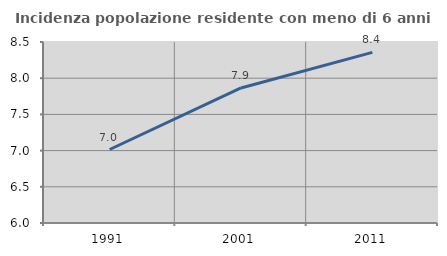
| Category | Incidenza popolazione residente con meno di 6 anni |
|---|---|
| 1991.0 | 7.015 |
| 2001.0 | 7.865 |
| 2011.0 | 8.357 |